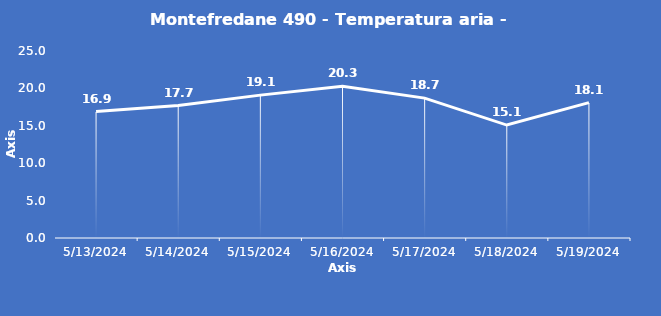
| Category | Montefredane 490 - Temperatura aria - Grezzo (°C) |
|---|---|
| 5/13/24 | 16.9 |
| 5/14/24 | 17.7 |
| 5/15/24 | 19.1 |
| 5/16/24 | 20.3 |
| 5/17/24 | 18.7 |
| 5/18/24 | 15.1 |
| 5/19/24 | 18.1 |